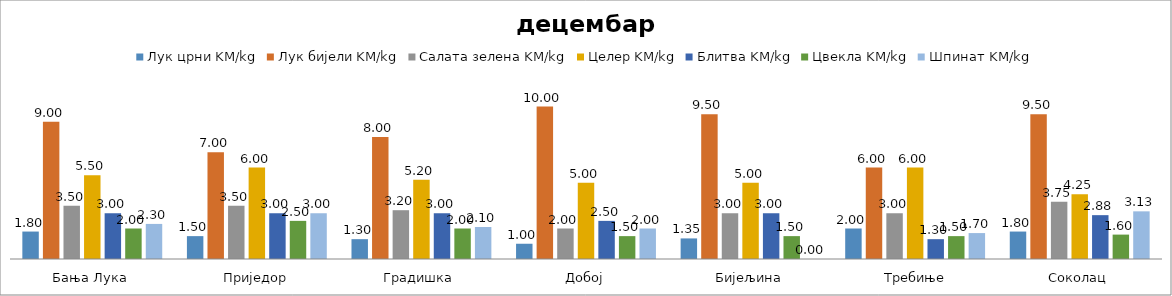
| Category | Лук црни KM/kg | Лук бијели KM/kg | Салата зелена KM/kg | Целер KM/kg | Блитва KM/kg | Цвекла KM/kg | Шпинат KM/kg |
|---|---|---|---|---|---|---|---|
| Бања Лука | 1.8 | 9 | 3.5 | 5.5 | 3 | 2 | 2.3 |
| Приједор | 1.5 | 7 | 3.5 | 6 | 3 | 2.5 | 3 |
| Градишка | 1.3 | 8 | 3.2 | 5.2 | 3 | 2 | 2.1 |
| Добој | 1 | 10 | 2 | 5 | 2.5 | 1.5 | 2 |
| Бијељина | 1.35 | 9.5 | 3 | 5 | 3 | 1.5 | 0 |
|  Требиње | 2 | 6 | 3 | 6 | 1.3 | 1.5 | 1.7 |
| Соколац | 1.8 | 9.5 | 3.75 | 4.25 | 2.875 | 1.6 | 3.125 |